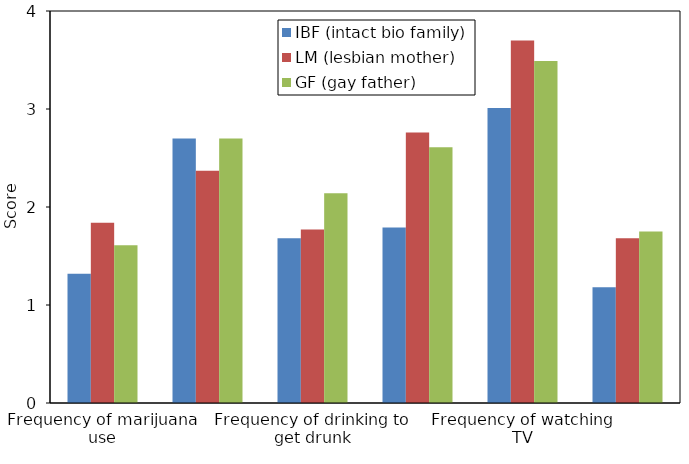
| Category | IBF (intact bio family) | LM (lesbian mother) | GF (gay father) |
|---|---|---|---|
| Frequency of marijuana use | 1.32 | 1.84 | 1.61 |
| Frequency of alcohol use | 2.7 | 2.37 | 2.7 |
| Frequency of drinking to get drunk | 1.68 | 1.77 | 2.14 |
| Frequency of smoking | 1.79 | 2.76 | 2.61 |
| Frequency of watching TV | 3.01 | 3.7 | 3.49 |
| Frequency of having been arrested | 1.18 | 1.68 | 1.75 |